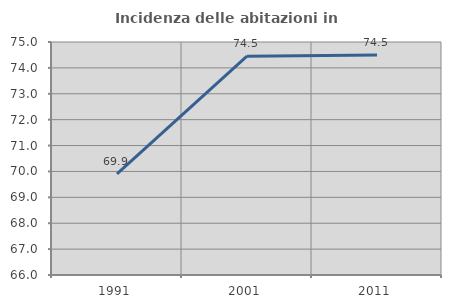
| Category | Incidenza delle abitazioni in proprietà  |
|---|---|
| 1991.0 | 69.904 |
| 2001.0 | 74.451 |
| 2011.0 | 74.493 |